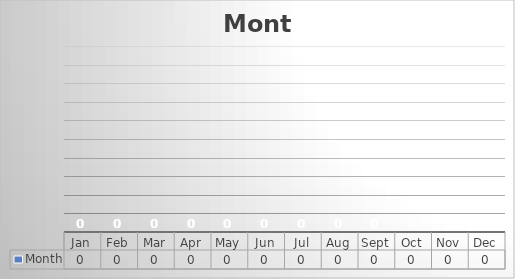
| Category | Month |
|---|---|
| Jan | 0 |
| Feb | 0 |
| Mar | 0 |
| Apr | 0 |
| May | 0 |
| Jun | 0 |
| Jul | 0 |
| Aug | 0 |
| Sept | 0 |
| Oct | 0 |
| Nov | 0 |
| Dec | 0 |